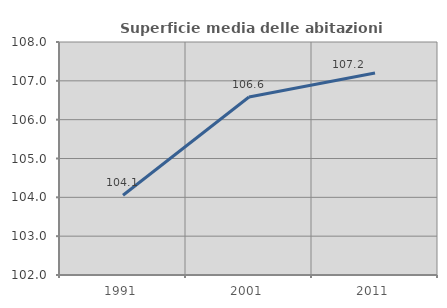
| Category | Superficie media delle abitazioni occupate |
|---|---|
| 1991.0 | 104.053 |
| 2001.0 | 106.583 |
| 2011.0 | 107.204 |